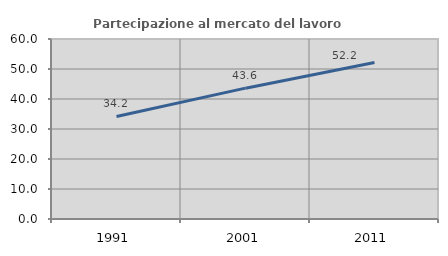
| Category | Partecipazione al mercato del lavoro  femminile |
|---|---|
| 1991.0 | 34.173 |
| 2001.0 | 43.614 |
| 2011.0 | 52.186 |